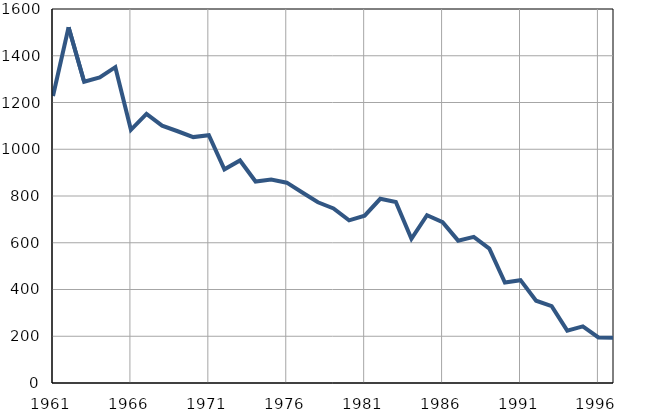
| Category | Умрла 
одојчад |
|---|---|
| 1961.0 | 1228 |
| 1962.0 | 1522 |
| 1963.0 | 1289 |
| 1964.0 | 1307 |
| 1965.0 | 1351 |
| 1966.0 | 1083 |
| 1967.0 | 1151 |
| 1968.0 | 1101 |
| 1969.0 | 1077 |
| 1970.0 | 1052 |
| 1971.0 | 1060 |
| 1972.0 | 914 |
| 1973.0 | 952 |
| 1974.0 | 862 |
| 1975.0 | 870 |
| 1976.0 | 857 |
| 1977.0 | 815 |
| 1978.0 | 773 |
| 1979.0 | 747 |
| 1980.0 | 696 |
| 1981.0 | 716 |
| 1982.0 | 788 |
| 1983.0 | 774 |
| 1984.0 | 617 |
| 1985.0 | 718 |
| 1986.0 | 688 |
| 1987.0 | 609 |
| 1988.0 | 625 |
| 1989.0 | 575 |
| 1990.0 | 430 |
| 1991.0 | 440 |
| 1992.0 | 352 |
| 1993.0 | 329 |
| 1994.0 | 224 |
| 1995.0 | 242 |
| 1996.0 | 195 |
| 1997.0 | 193 |